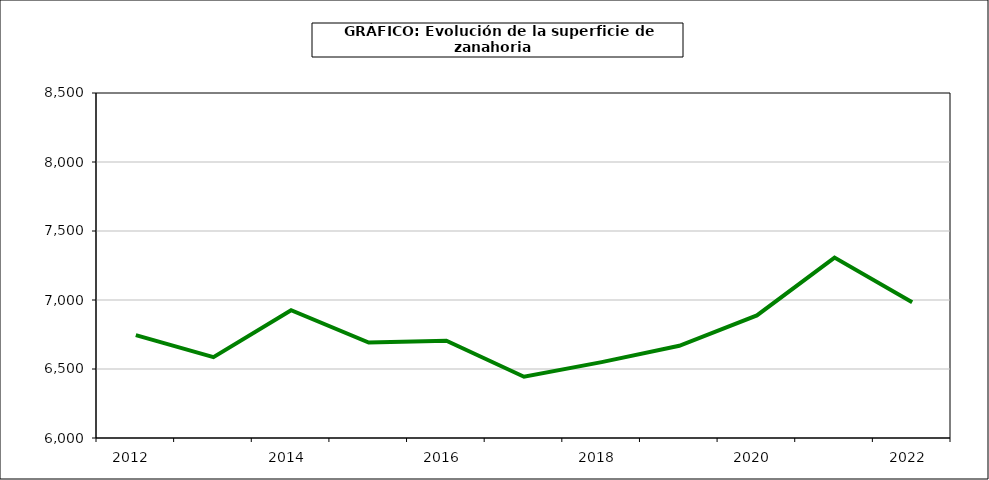
| Category | superficie |
|---|---|
| 2012.0 | 6745 |
| 2013.0 | 6586 |
| 2014.0 | 6926 |
| 2015.0 | 6692 |
| 2016.0 | 6705 |
| 2017.0 | 6444 |
| 2018.0 | 6550 |
| 2019.0 | 6668 |
| 2020.0 | 6888 |
| 2021.0 | 7307 |
| 2022.0 | 6984 |